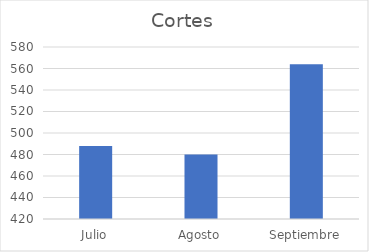
| Category | Cortes |
|---|---|
| Julio | 488 |
| Agosto | 480 |
| Septiembre | 564 |